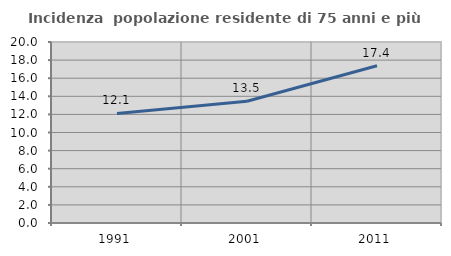
| Category | Incidenza  popolazione residente di 75 anni e più |
|---|---|
| 1991.0 | 12.11 |
| 2001.0 | 13.46 |
| 2011.0 | 17.378 |